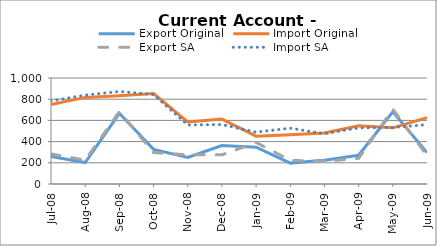
| Category | Export Original | Import Original | Export SA | Import SA |
|---|---|---|---|---|
| 2008-07-31 | 260 | 750 | 284 | 783 |
| 2008-08-31 | 202 | 817 | 225 | 839 |
| 2008-09-30 | 667 | 833 | 682 | 873 |
| 2008-10-31 | 327 | 854 | 297 | 844 |
| 2008-11-30 | 251 | 585 | 275 | 557 |
| 2008-12-31 | 363 | 612 | 275 | 561 |
| 2009-01-31 | 347 | 451 | 392 | 489 |
| 2009-02-28 | 197 | 465 | 223 | 527 |
| 2009-03-31 | 224 | 482 | 214 | 474 |
| 2009-04-30 | 271 | 550 | 242 | 530 |
| 2009-05-31 | 681 | 530 | 706 | 533 |
| 2009-06-30 | 297 | 626 | 269 | 560 |